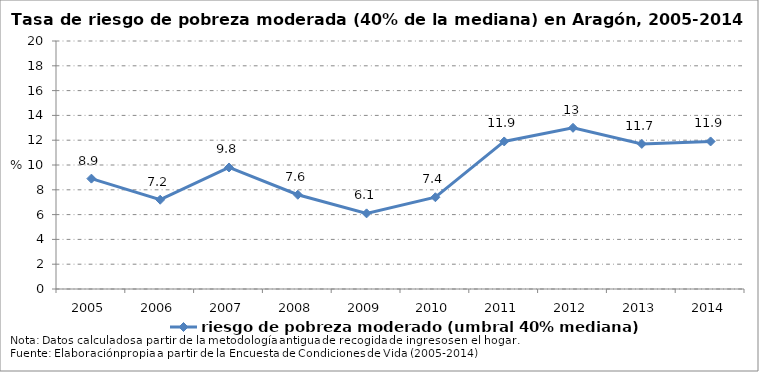
| Category | riesgo de pobreza moderado (umbral 40% mediana) |
|---|---|
| 2005.0 | 8.9 |
| 2006.0 | 7.2 |
| 2007.0 | 9.8 |
| 2008.0 | 7.6 |
| 2009.0 | 6.1 |
| 2010.0 | 7.4 |
| 2011.0 | 11.9 |
| 2012.0 | 13 |
| 2013.0 | 11.7 |
| 2014.0 | 11.9 |